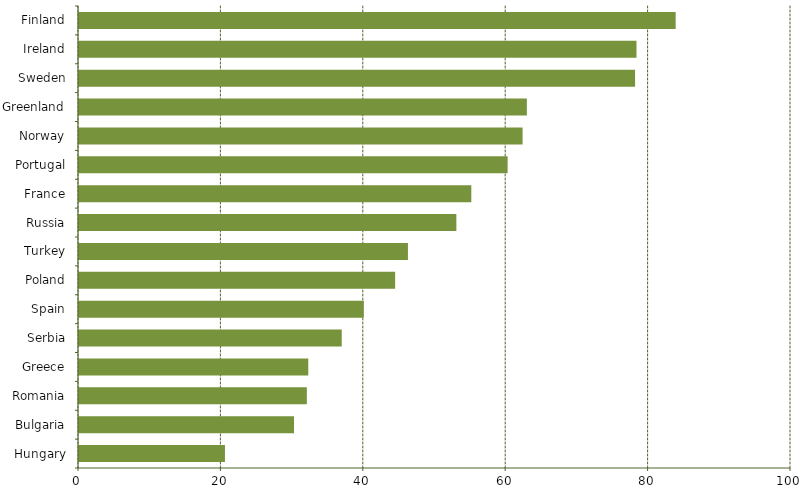
| Category | Series 0 |
|---|---|
| Hungary | 20.5 |
| Bulgaria | 30.2 |
| Romania | 32 |
| Greece | 32.2 |
| Serbia | 36.9 |
| Spain | 40 |
| Poland | 44.4 |
| Turkey | 46.2 |
| Russia | 53 |
| France | 55.1 |
| Portugal | 60.2 |
| Norway | 62.3 |
| Greenland | 62.9 |
| Sweden | 78.1 |
| Ireland | 78.3 |
| Finland | 83.8 |